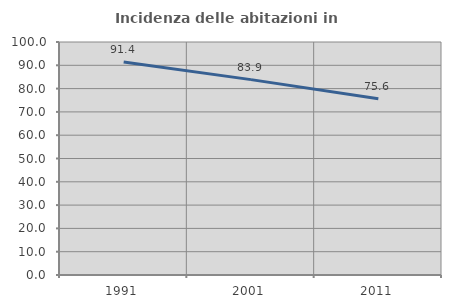
| Category | Incidenza delle abitazioni in proprietà  |
|---|---|
| 1991.0 | 91.393 |
| 2001.0 | 83.857 |
| 2011.0 | 75.625 |